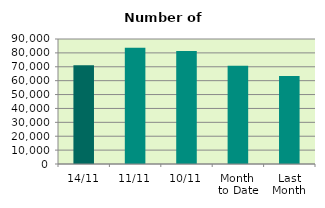
| Category | Series 0 |
|---|---|
| 14/11 | 71056 |
| 11/11 | 83694 |
| 10/11 | 81382 |
| Month 
to Date | 70800.4 |
| Last
Month | 63348.667 |